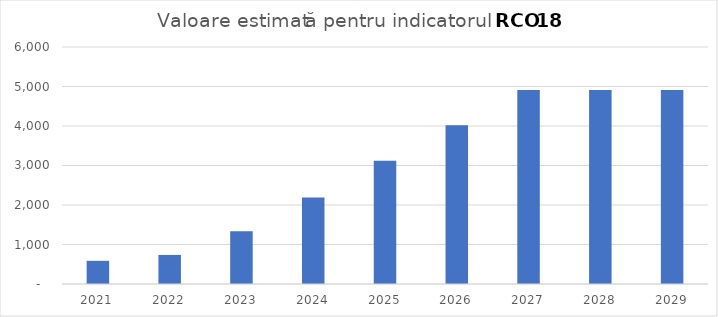
| Category | Series 0 |
|---|---|
| 2021.0 | 586.737 |
| 2022.0 | 735.907 |
| 2023.0 | 1332.589 |
| 2024.0 | 2187.833 |
| 2025.0 | 3122.634 |
| 2026.0 | 4017.657 |
| 2027.0 | 4912.68 |
| 2028.0 | 4912.68 |
| 2029.0 | 4912.68 |